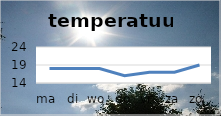
| Category | temperatuur |
|---|---|
| ma | 18 |
| di | 18 |
| wo | 18 |
| do | 16 |
| vr | 17 |
| za | 17 |
| zo | 19 |